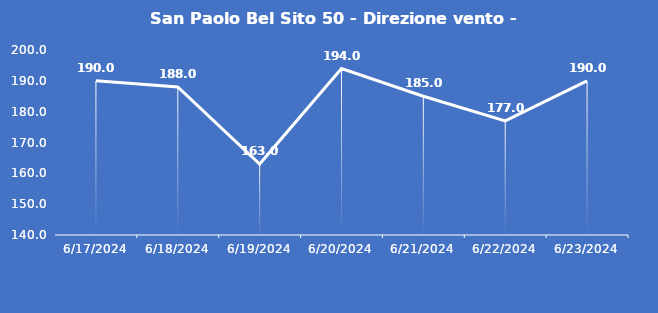
| Category | San Paolo Bel Sito 50 - Direzione vento - Grezzo (°N) |
|---|---|
| 6/17/24 | 190 |
| 6/18/24 | 188 |
| 6/19/24 | 163 |
| 6/20/24 | 194 |
| 6/21/24 | 185 |
| 6/22/24 | 177 |
| 6/23/24 | 190 |